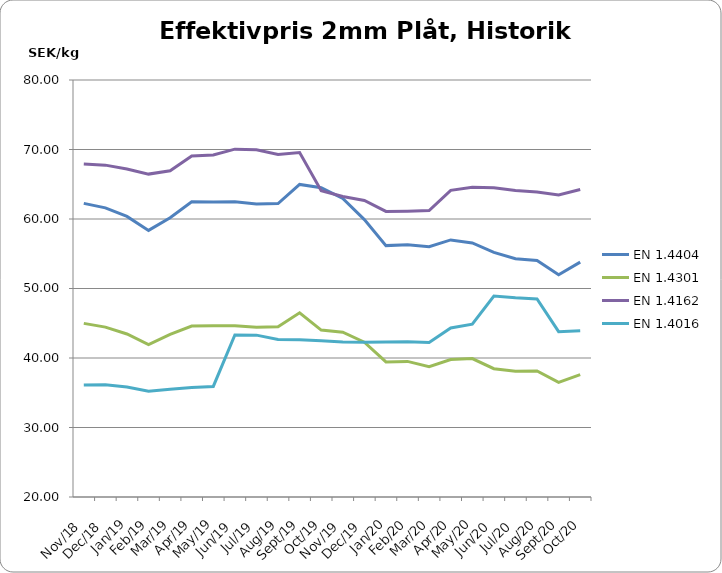
| Category | EN 1.4404 | EN 1.4301 | EN 1.4162  | EN 1.4016 |
|---|---|---|---|---|
| 2018-11-01 | 62.25 | 44.98 | 67.92 | 36.1 |
| 2018-12-01 | 61.6 | 44.44 | 67.75 | 36.15 |
| 2019-01-01 | 60.37 | 43.46 | 67.19 | 35.83 |
| 2019-02-01 | 58.36 | 41.94 | 66.46 | 35.21 |
| 2019-03-01 | 60.17 | 43.39 | 66.93 | 35.52 |
| 2019-04-01 | 62.47 | 44.59 | 69.06 | 35.76 |
| 2019-05-01 | 62.45 | 44.64 | 69.21 | 35.91 |
| 2019-06-01 | 62.47 | 44.64 | 70.05 | 43.31 |
| 2019-07-01 | 62.16 | 44.44 | 69.96 | 43.29 |
| 2019-08-01 | 62.22 | 44.5 | 69.28 | 42.65 |
| 2019-09-01 | 64.97 | 46.5 | 69.57 | 42.62 |
| 2019-10-01 | 64.51 | 44.02 | 64.06 | 42.48 |
| 2019-11-01 | 62.95 | 43.71 | 63.23 | 42.31 |
| 2019-12-01 | 59.92 | 42.28 | 62.66 | 42.27 |
| 2020-01-01 | 56.17 | 39.44 | 61.09 | 42.3 |
| 2020-02-01 | 56.29 | 39.51 | 61.13 | 42.35 |
| 2020-03-01 | 56.011 | 38.762 | 61.207 | 42.238 |
| 2020-04-01 | 56.99 | 39.78 | 64.12 | 44.32 |
| 2020-05-01 | 56.561 | 39.922 | 64.555 | 44.865 |
| 2020-06-01 | 55.205 | 38.457 | 64.504 | 48.924 |
| 2020-07-01 | 54.28 | 38.09 | 64.1 | 48.67 |
| 2020-08-01 | 54.032 | 38.136 | 63.889 | 48.499 |
| 2020-09-01 | 51.982 | 36.492 | 63.459 | 43.787 |
| 2020-10-01 | 53.8 | 37.597 | 64.242 | 43.938 |